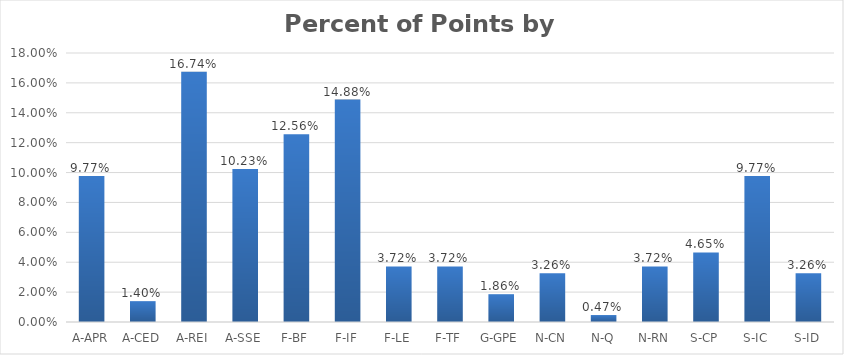
| Category | Percent |
|---|---|
| A-APR | 0.098 |
| A-CED | 0.014 |
| A-REI | 0.167 |
| A-SSE | 0.102 |
| F-BF | 0.126 |
| F-IF | 0.149 |
| F-LE | 0.037 |
| F-TF | 0.037 |
| G-GPE | 0.019 |
| N-CN | 0.033 |
| N-Q | 0.005 |
| N-RN | 0.037 |
| S-CP | 0.047 |
| S-IC | 0.098 |
| S-ID | 0.033 |